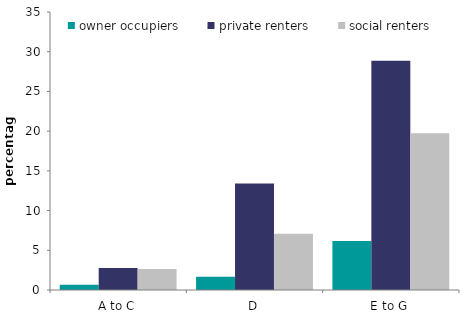
| Category | owner occupiers | private renters | social renters |
|---|---|---|---|
| A to C | 0.657 | 2.77 | 2.658 |
| D | 1.654 | 13.418 | 7.082 |
| E to G | 6.181 | 28.872 | 19.737 |